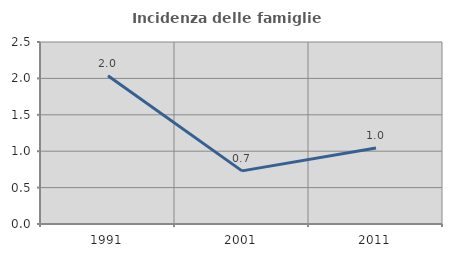
| Category | Incidenza delle famiglie numerose |
|---|---|
| 1991.0 | 2.036 |
| 2001.0 | 0.73 |
| 2011.0 | 1.044 |